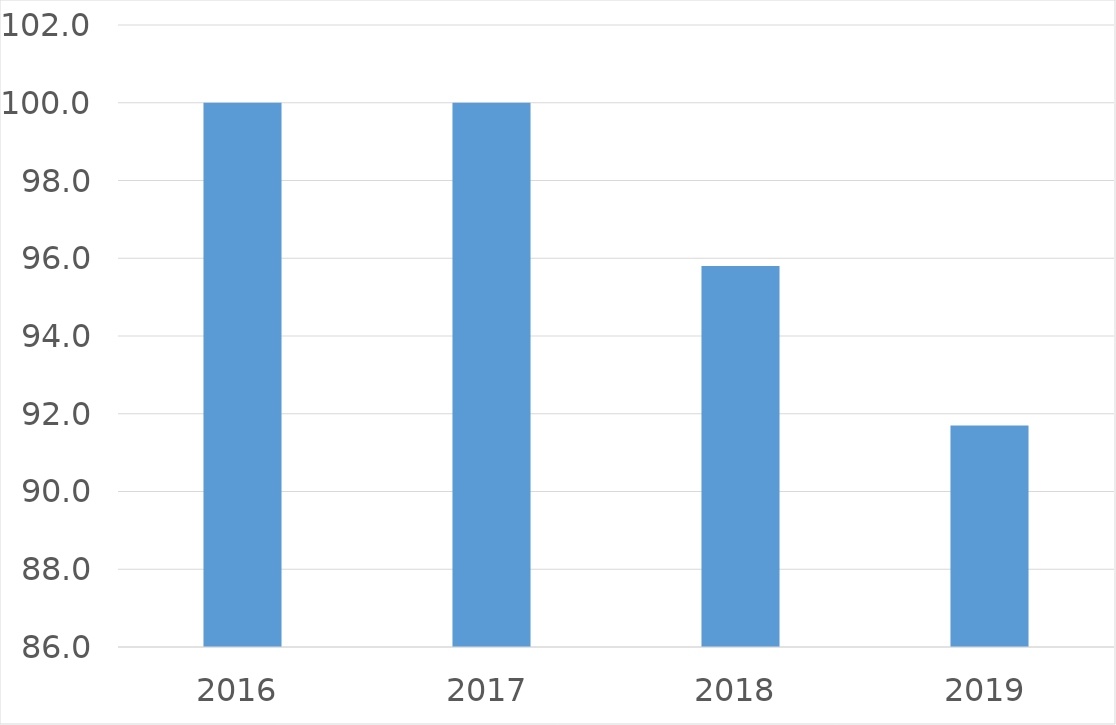
| Category | Series 0 |
|---|---|
| 2016 | 100 |
| 2017 | 100 |
| 2018 | 95.8 |
| 2019 | 91.7 |